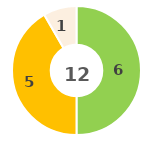
| Category | Series 0 |
|---|---|
| 0 | 0 |
| 1 | 6 |
| 2 | 5 |
| 3 | 0 |
| 4 | 1 |